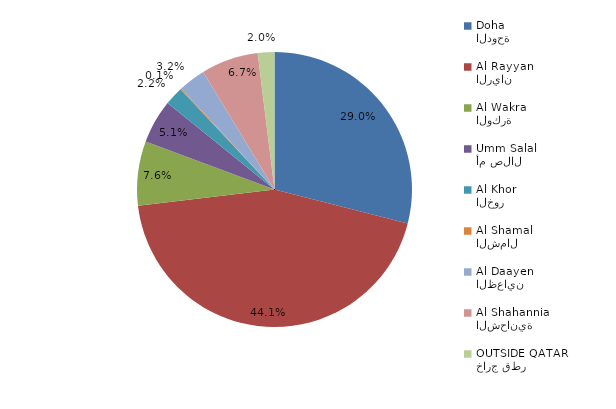
| Category | Series 0 |
|---|---|
| الدوحة
Doha | 237 |
| الريان
Al Rayyan | 361 |
| الوكرة
Al Wakra | 62 |
| أم صلال
Umm Salal | 42 |
| الخور
Al Khor | 18 |
| الشمال
Al Shamal | 1 |
| الظعاين
Al Daayen | 26 |
| الشحانية 
Al Shahannia | 55 |
| خارج قطر
OUTSIDE QATAR | 16 |